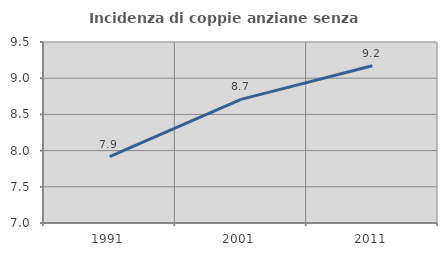
| Category | Incidenza di coppie anziane senza figli  |
|---|---|
| 1991.0 | 7.918 |
| 2001.0 | 8.708 |
| 2011.0 | 9.172 |